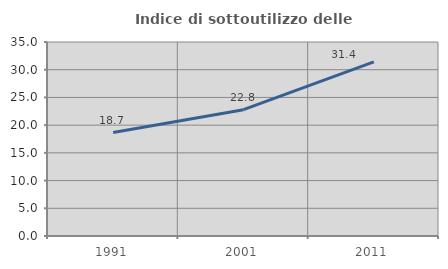
| Category | Indice di sottoutilizzo delle abitazioni  |
|---|---|
| 1991.0 | 18.662 |
| 2001.0 | 22.792 |
| 2011.0 | 31.422 |